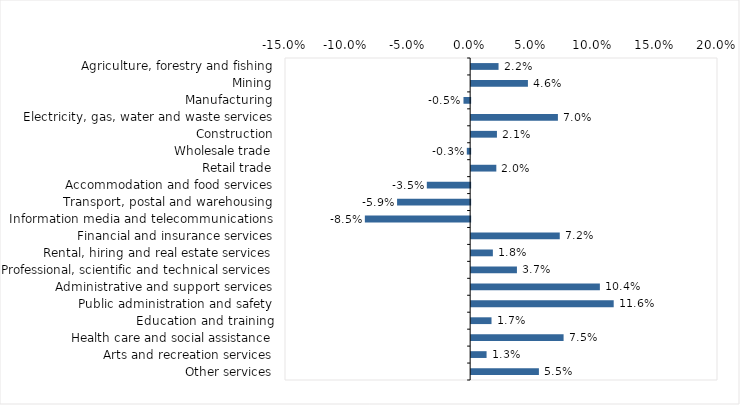
| Category | This week |
|---|---|
| Agriculture, forestry and fishing | 0.022 |
| Mining | 0.046 |
| Manufacturing | -0.005 |
| Electricity, gas, water and waste services | 0.07 |
| Construction | 0.021 |
| Wholesale trade | -0.003 |
| Retail trade | 0.02 |
| Accommodation and food services | -0.035 |
| Transport, postal and warehousing | -0.059 |
| Information media and telecommunications | -0.085 |
| Financial and insurance services | 0.072 |
| Rental, hiring and real estate services | 0.018 |
| Professional, scientific and technical services | 0.037 |
| Administrative and support services | 0.104 |
| Public administration and safety | 0.116 |
| Education and training | 0.016 |
| Health care and social assistance | 0.075 |
| Arts and recreation services | 0.012 |
| Other services | 0.055 |